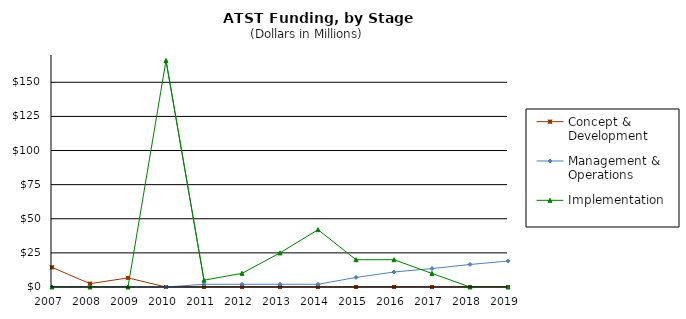
| Category | Concept & Development | Management & Operations | Implementation |
|---|---|---|---|
| 2007.0 | 14.4 | 0 | 0 |
| 2008.0 | 2.44 | 0 | 0 |
| 2009.0 | 6.67 | 0 | 0 |
| 2010.0 | 0 | 0 | 166 |
| 2011.0 | 0 | 2 | 5 |
| 2012.0 | 0 | 2 | 10 |
| 2013.0 | 0 | 2 | 25 |
| 2014.0 | 0 | 2 | 42 |
| 2015.0 | 0 | 7 | 20 |
| 2016.0 | 0 | 11 | 20 |
| 2017.0 | 0 | 13.5 | 9.93 |
| 2018.0 | 0 | 16.5 | 0 |
| 2019.0 | 0 | 19 | 0 |